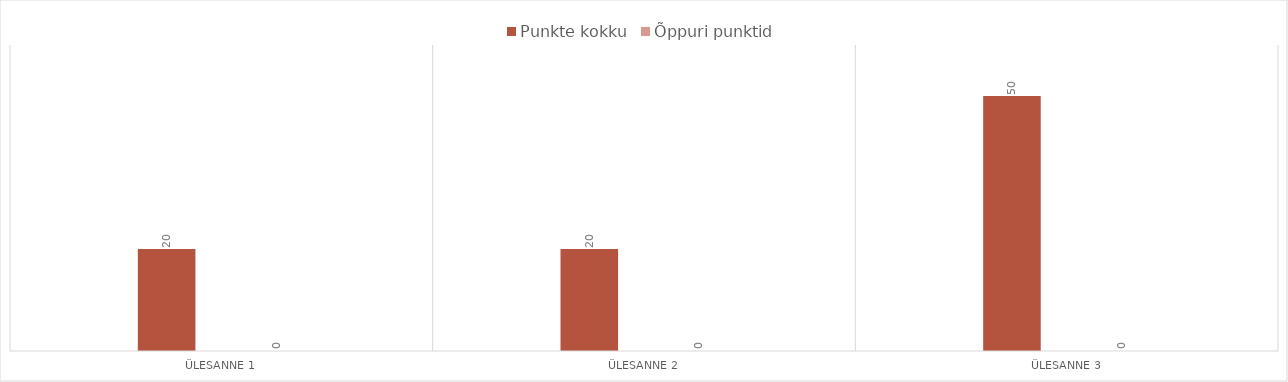
| Category | Punkte kokku | Õppuri punktid |
|---|---|---|
| Ülesanne 1 | 20 | 20 |
| Ülesanne 2 | 20 | 20 |
| Ülesanne 3 | 50 | 50 |